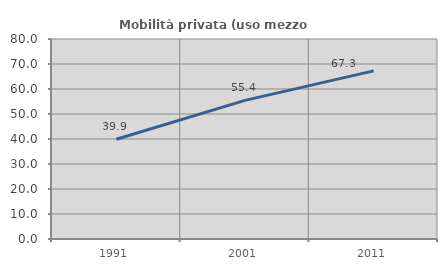
| Category | Mobilità privata (uso mezzo privato) |
|---|---|
| 1991.0 | 39.924 |
| 2001.0 | 55.436 |
| 2011.0 | 67.258 |